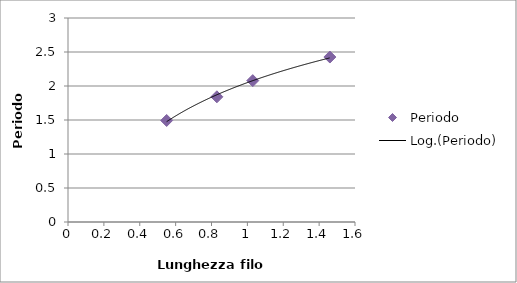
| Category | Periodo |
|---|---|
| 0.55 | 1.493 |
| 0.83 | 1.841 |
| 1.03 | 2.079 |
| 1.46 | 2.426 |